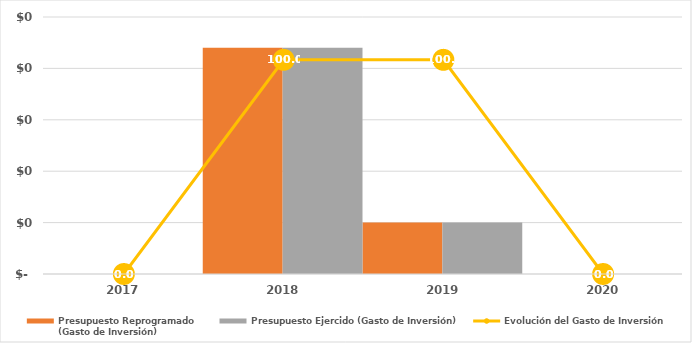
| Category | Presupuesto Reprogramado
(Gasto de Inversión) | Presupuesto Ejercido (Gasto de Inversión) |
|---|---|---|
| 2017.0 | 0 | 0 |
| 2018.0 | 22 | 22 |
| 2019.0 | 5 | 5 |
| 2020.0 | 0 | 0 |